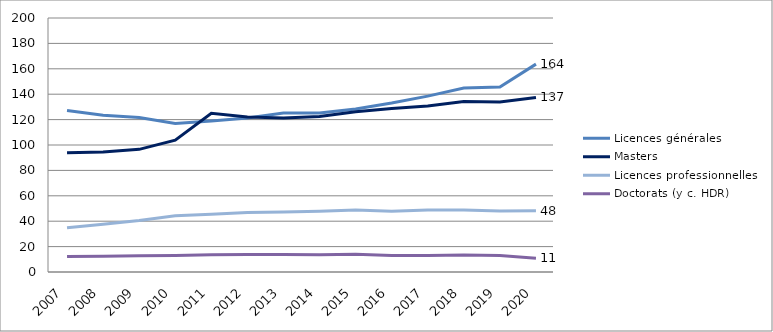
| Category | Licences générales | Masters | Licences professionnelles | Doctorats (y c. HDR) |
|---|---|---|---|---|
| 2007.0 | 127.232 | 93.83 | 34.915 | 12.129 |
| 2008.0 | 123.465 | 94.546 | 37.665 | 12.476 |
| 2009.0 | 121.592 | 96.566 | 40.52 | 12.824 |
| 2010.0 | 116.996 | 103.861 | 44.235 | 12.988 |
| 2011.0 | 118.959 | 124.903 | 45.378 | 13.489 |
| 2012.0 | 121.326 | 122.044 | 46.76 | 13.686 |
| 2013.0 | 125.163 | 121.298 | 47.304 | 13.748 |
| 2014.0 | 125.19 | 122.426 | 47.749 | 13.675 |
| 2015.0 | 128.396 | 126.262 | 48.744 | 13.957 |
| 2016.0 | 133.053 | 128.815 | 47.777 | 13.008 |
| 2017.0 | 138.499 | 130.716 | 48.823 | 12.939 |
| 2018.0 | 144.838 | 134.173 | 48.753 | 13.314 |
| 2019.0 | 145.629 | 133.813 | 47.979 | 12.988 |
| 2020.0 | 163.687 | 137.455 | 48.156 | 10.84 |